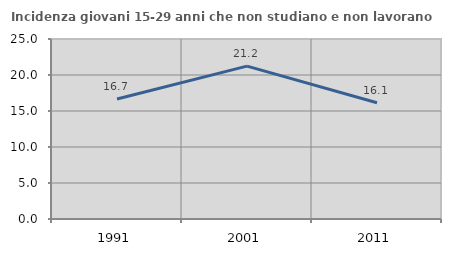
| Category | Incidenza giovani 15-29 anni che non studiano e non lavorano  |
|---|---|
| 1991.0 | 16.667 |
| 2001.0 | 21.226 |
| 2011.0 | 16.149 |